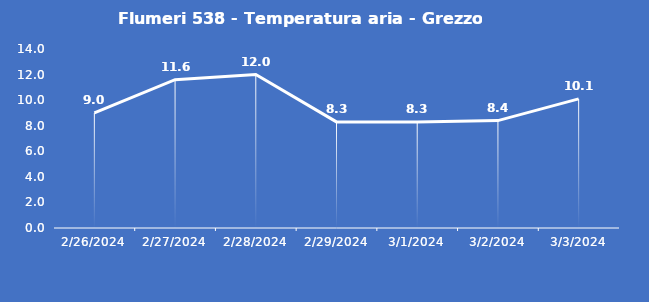
| Category | Flumeri 538 - Temperatura aria - Grezzo (°C) |
|---|---|
| 2/26/24 | 9 |
| 2/27/24 | 11.6 |
| 2/28/24 | 12 |
| 2/29/24 | 8.3 |
| 3/1/24 | 8.3 |
| 3/2/24 | 8.4 |
| 3/3/24 | 10.1 |